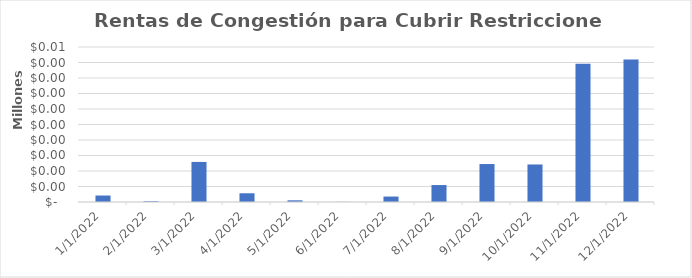
| Category | Rentas de Congestión para Cubrir Restricciones (COP) |
|---|---|
| 1/1/22 | 208.476 |
| 2/1/22 | 24.094 |
| 3/1/22 | 1292.836 |
| 4/1/22 | 281.796 |
| 5/1/22 | 54.218 |
| 6/1/22 | 4.524 |
| 7/1/22 | 175.452 |
| 8/1/22 | 546.621 |
| 9/1/22 | 1224.456 |
| 10/1/22 | 1210.701 |
| 11/1/22 | 4461.329 |
| 12/1/22 | 4595.666 |